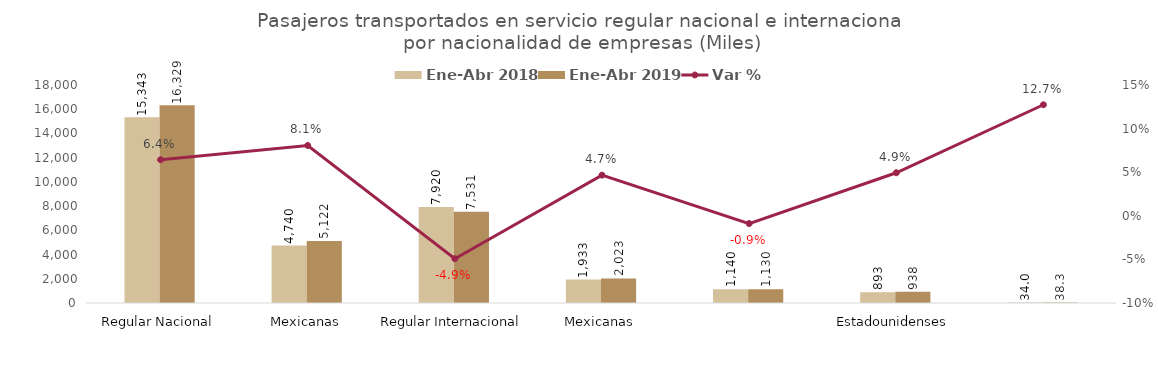
| Category | Ene-Abr 2018 | Ene-Abr 2019 |
|---|---|---|
| 0 | 15343.006 | 16329.452 |
| 1 | 4740.161 | 5122.487 |
| 2 | 7920.113 | 7530.544 |
| 3 | 1933.25 | 2023.403 |
| 4 | 1139.654 | 1129.514 |
| 5 | 893.473 | 937.592 |
| 6 | 34.006 | 38.337 |